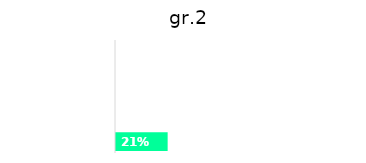
| Category | gr.2 |
|---|---|
| grove motoriek | 0.214 |
| fijne motoriek | 0 |